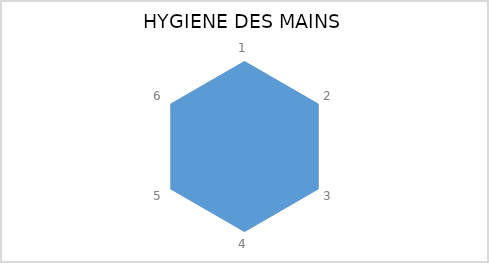
| Category | Series 0 |
|---|---|
| 1.0 | 1 |
| 2.0 | 1 |
| 3.0 | 1 |
| 4.0 | 1 |
| 5.0 | 1 |
| 6.0 | 1 |